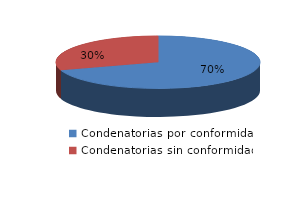
| Category | Series 0 |
|---|---|
| 0 | 14 |
| 1 | 6 |